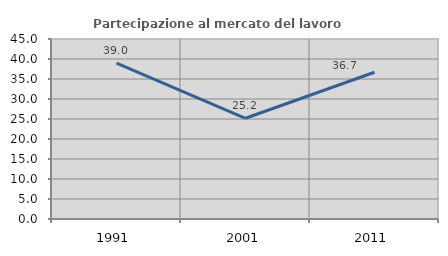
| Category | Partecipazione al mercato del lavoro  femminile |
|---|---|
| 1991.0 | 38.994 |
| 2001.0 | 25.185 |
| 2011.0 | 36.682 |